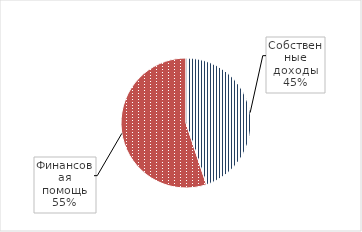
| Category | Series 0 |
|---|---|
| Собственные доходы | 299326 |
| Финансовая помощь | 367499 |